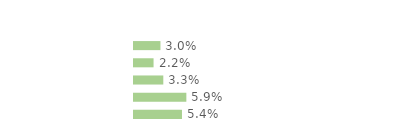
| Category | Series 0 |
|---|---|
| Communes rurales | 0.03 |
| moins de 20 000 hab. | 0.022 |
| 20 000 - 100 000 hab. | 0.033 |
| 100 000 hab. ou plus | 0.059 |
| Agglomération parisienne | 0.054 |